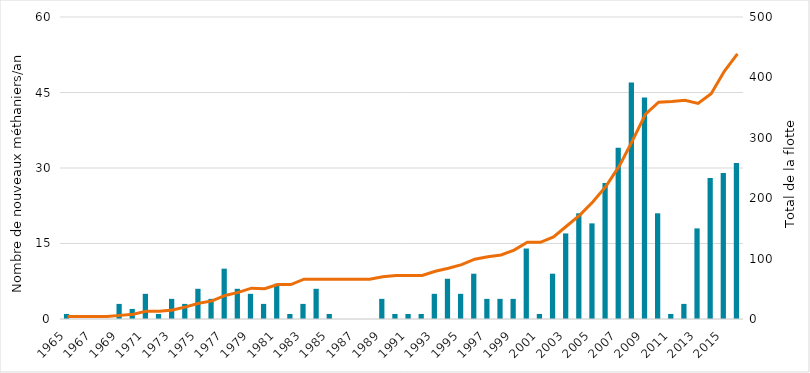
| Category | Number of new LNG carriers |
|---|---|
| 1965.0 | 1 |
| 1966.0 | 0 |
| 1967.0 | 0 |
| 1968.0 | 0 |
| 1969.0 | 3 |
| 1970.0 | 2 |
| 1971.0 | 5 |
| 1972.0 | 1 |
| 1973.0 | 4 |
| 1974.0 | 3 |
| 1975.0 | 6 |
| 1976.0 | 4 |
| 1977.0 | 10 |
| 1978.0 | 6 |
| 1979.0 | 5 |
| 1980.0 | 3 |
| 1981.0 | 7 |
| 1982.0 | 1 |
| 1983.0 | 3 |
| 1984.0 | 6 |
| 1985.0 | 1 |
| 1986.0 | 0 |
| 1987.0 | 0 |
| 1988.0 | 0 |
| 1989.0 | 4 |
| 1990.0 | 1 |
| 1991.0 | 1 |
| 1992.0 | 1 |
| 1993.0 | 5 |
| 1994.0 | 8 |
| 1995.0 | 5 |
| 1996.0 | 9 |
| 1997.0 | 4 |
| 1998.0 | 4 |
| 1999.0 | 4 |
| 2000.0 | 14 |
| 2001.0 | 1 |
| 2002.0 | 9 |
| 2003.0 | 17 |
| 2004.0 | 21 |
| 2005.0 | 19 |
| 2006.0 | 27 |
| 2007.0 | 34 |
| 2008.0 | 47 |
| 2009.0 | 44 |
| 2010.0 | 21 |
| 2011.0 | 1 |
| 2012.0 | 3 |
| 2013.0 | 18 |
| 2014.0 | 28 |
| 2015.0 | 29 |
| 2016.0 | 31 |